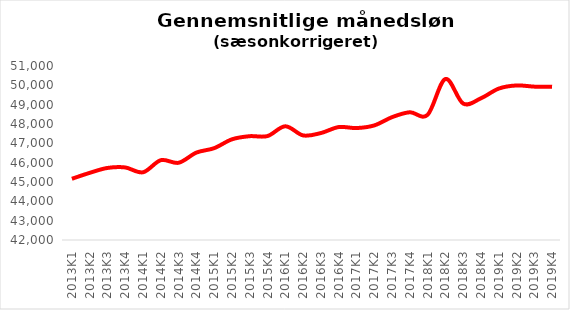
| Category | Series 0 |
|---|---|
| 2013K1 | 45166.623 |
| 2013K2 | 45472.769 |
| 2013K3 | 45726.968 |
| 2013K4 | 45752.809 |
| 2014K1 | 45503.018 |
| 2014K2 | 46129.095 |
| 2014K3 | 45994.827 |
| 2014K4 | 46520.867 |
| 2015K1 | 46750.145 |
| 2015K2 | 47207.485 |
| 2015K3 | 47369.991 |
| 2015K4 | 47376.732 |
| 2016K1 | 47882.151 |
| 2016K2 | 47409.771 |
| 2016K3 | 47531.971 |
| 2016K4 | 47840.837 |
| 2017K1 | 47790.062 |
| 2017K2 | 47926.424 |
| 2017K3 | 48353.713 |
| 2017K4 | 48606.997 |
| 2018K1 | 48475.613 |
| 2018K2 | 50325.878 |
| 2018K3 | 49057.083 |
| 2018K4 | 49330.884 |
| 2019K1 | 49831.302 |
| 2019K2 | 49993.649 |
| 2019K3 | 49933.004 |
| 2019K4 | 49920.16 |